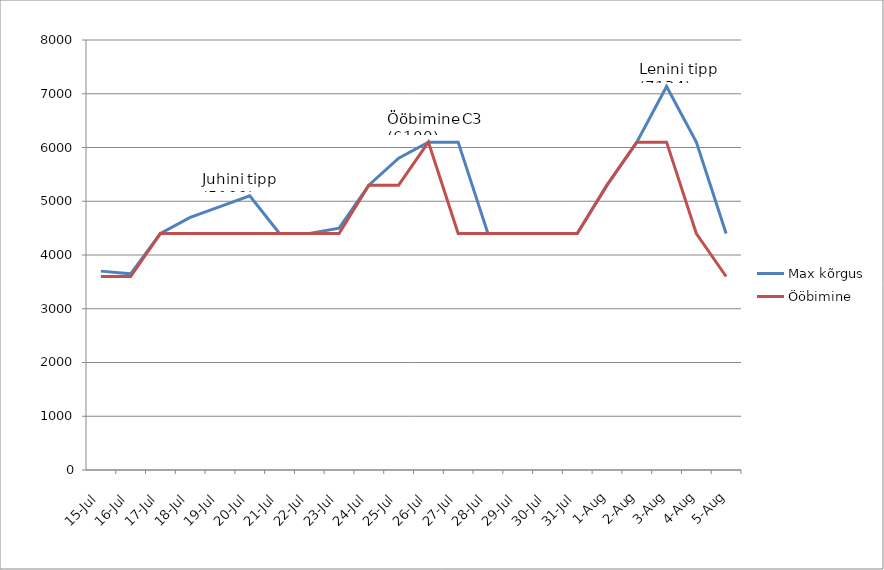
| Category | Max kõrgus | Ööbimine |
|---|---|---|
| 2016-07-15 | 3700 | 3600 |
| 2016-07-16 | 3650 | 3600 |
| 2016-07-17 | 4400 | 4400 |
| 2016-07-18 | 4700 | 4400 |
| 2016-07-19 | 4900 | 4400 |
| 2016-07-20 | 5100 | 4400 |
| 2016-07-21 | 4400 | 4400 |
| 2016-07-22 | 4400 | 4400 |
| 2016-07-23 | 4500 | 4400 |
| 2016-07-24 | 5300 | 5300 |
| 2016-07-25 | 5800 | 5300 |
| 2016-07-26 | 6100 | 6100 |
| 2016-07-27 | 6100 | 4400 |
| 2016-07-28 | 4400 | 4400 |
| 2016-07-29 | 4400 | 4400 |
| 2016-07-30 | 4400 | 4400 |
| 2016-07-31 | 4400 | 4400 |
| 2016-08-01 | 5300 | 5300 |
| 2016-08-02 | 6100 | 6100 |
| 2016-08-03 | 7134 | 6100 |
| 2016-08-04 | 6100 | 4400 |
| 2016-08-05 | 4400 | 3600 |